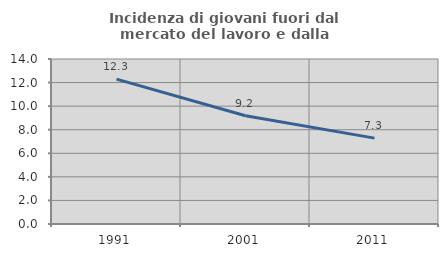
| Category | Incidenza di giovani fuori dal mercato del lavoro e dalla formazione  |
|---|---|
| 1991.0 | 12.295 |
| 2001.0 | 9.18 |
| 2011.0 | 7.287 |